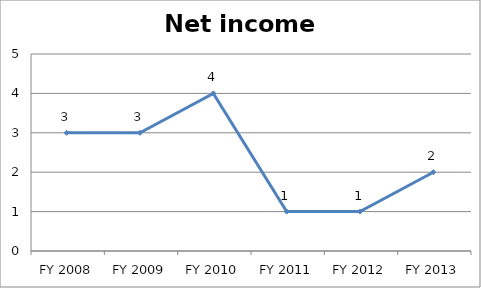
| Category | Net income score |
|---|---|
| FY 2013 | 2 |
| FY 2012 | 1 |
| FY 2011 | 1 |
| FY 2010 | 4 |
| FY 2009 | 3 |
| FY 2008 | 3 |